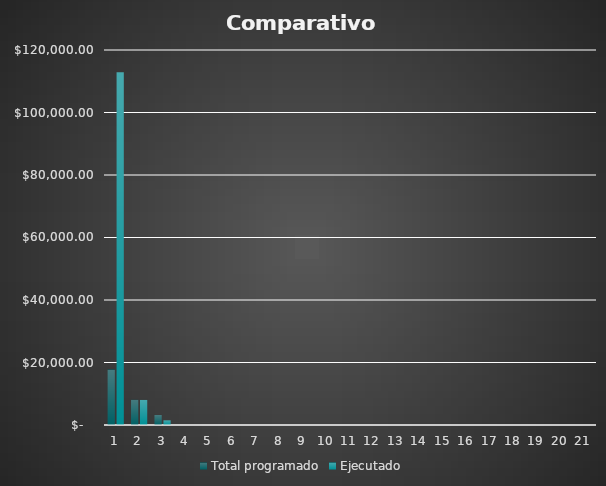
| Category | Total programado | Ejecutado |
|---|---|---|
| 0 | 17750 | 112857 |
| 1 | 8050 | 8017 |
| 2 | 3200 | 1500 |
| 3 | 0 | 0 |
| 4 | 0 | 0 |
| 5 | 0 | 0 |
| 6 | 0 | 0 |
| 7 | 0 | 0 |
| 8 | 0 | 0 |
| 9 | 0 | 0 |
| 10 | 0 | 0 |
| 11 | 0 | 0 |
| 12 | 0 | 0 |
| 13 | 0 | 0 |
| 14 | 0 | 0 |
| 15 | 0 | 0 |
| 16 | 0 | 0 |
| 17 | 0 | 0 |
| 18 | 0 | 0 |
| 19 | 0 | 0 |
| 20 | 0 | 0 |